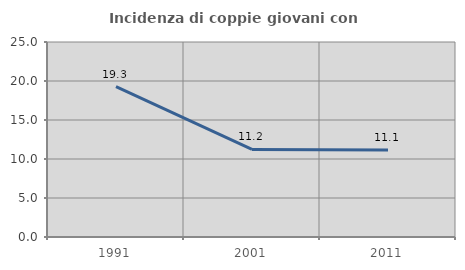
| Category | Incidenza di coppie giovani con figli |
|---|---|
| 1991.0 | 19.271 |
| 2001.0 | 11.231 |
| 2011.0 | 11.142 |